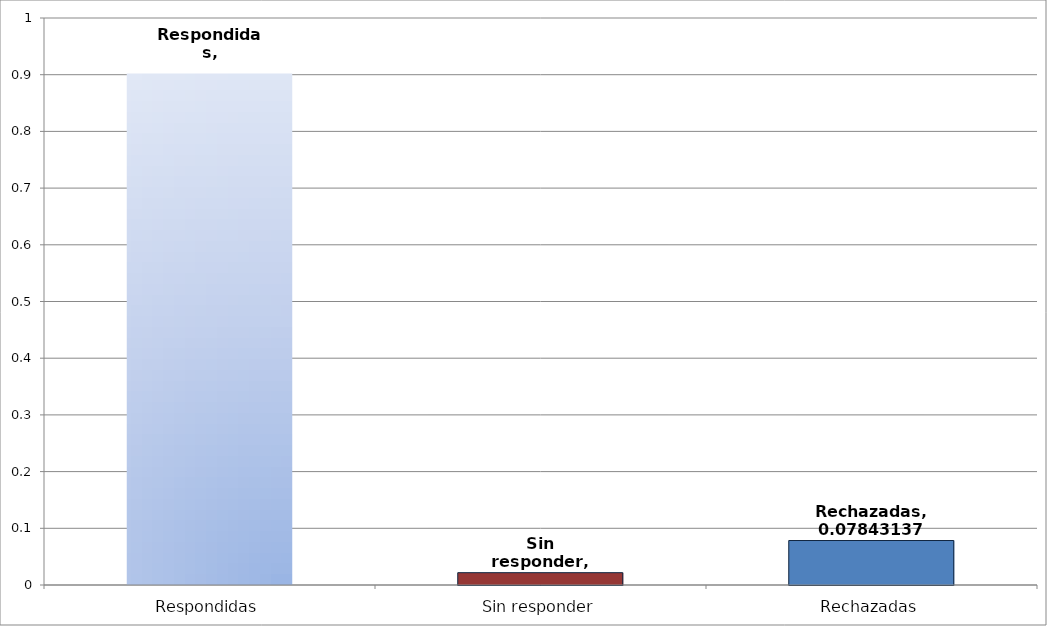
| Category | Series 0 |
|---|---|
| Respondidas | 0.902 |
| Sin responder | 0.022 |
| Rechazadas | 0.078 |